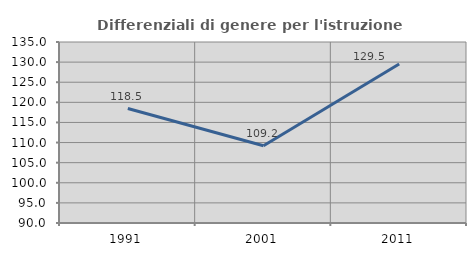
| Category | Differenziali di genere per l'istruzione superiore |
|---|---|
| 1991.0 | 118.46 |
| 2001.0 | 109.218 |
| 2011.0 | 129.543 |